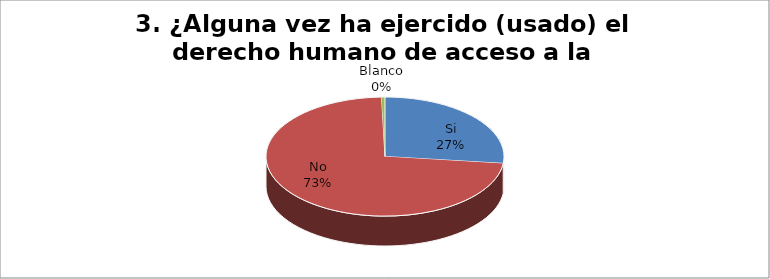
| Category | Series 0 |
|---|---|
| Si | 0.268 |
| No | 0.727 |
| Blanco | 0.005 |